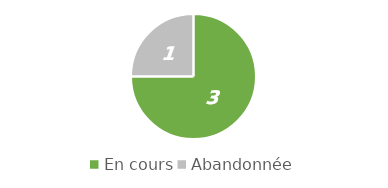
| Category | Series 0 |
|---|---|
| En cours | 3 |
| Abandonnée | 1 |